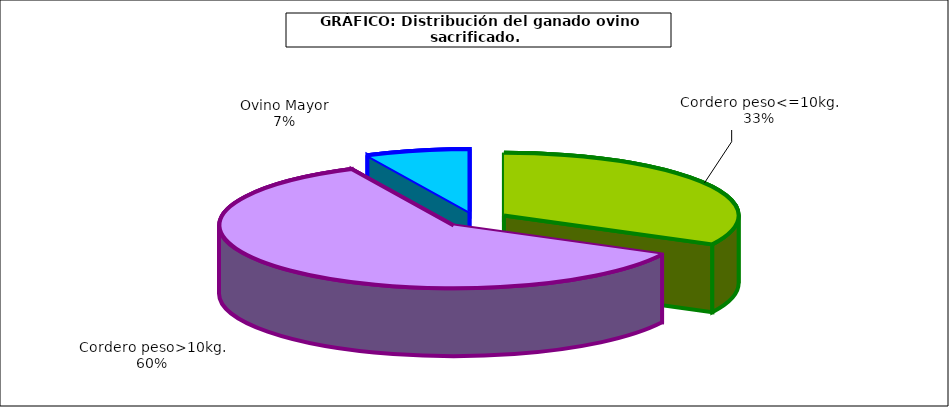
| Category | Series 0 |
|---|---|
| 0 | 3280557 |
| 1 | 6058916 |
| 2 | 720572 |